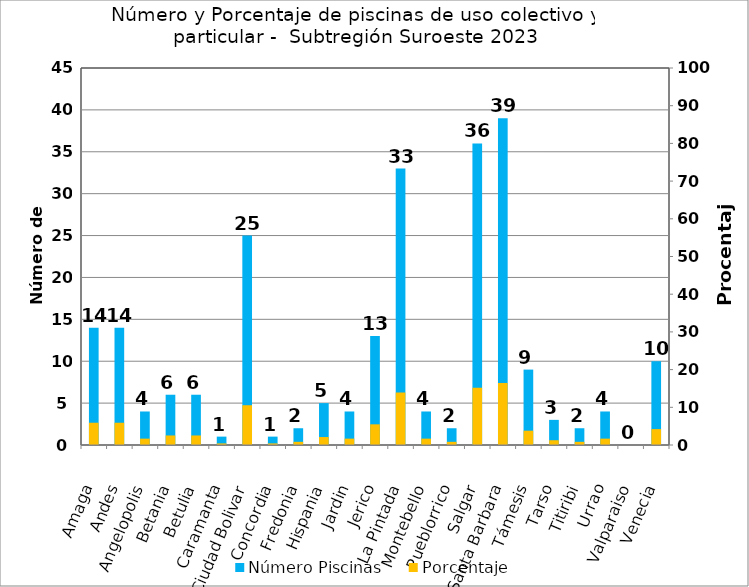
| Category | Número Piscinas |
|---|---|
| Amaga | 14 |
| Andes | 14 |
| Angelopolis | 4 |
| Betania | 6 |
| Betulia | 6 |
| Caramanta | 1 |
| Ciudad Bolivar | 25 |
| Concordia | 1 |
| Fredonia | 2 |
| Hispania | 5 |
| Jardin | 4 |
| Jerico | 13 |
| La Pintada | 33 |
| Montebello | 4 |
| Pueblorrico | 2 |
| Salgar | 36 |
| Santa Barbara | 39 |
| Támesis | 9 |
| Tarso | 3 |
| Titiribi | 2 |
| Urrao | 4 |
| Valparaiso | 0 |
| Venecia | 10 |